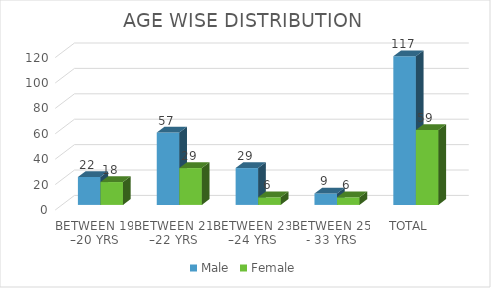
| Category | Male | Female |
|---|---|---|
| BETWEEN 19 –20 YRS | 22 | 18 |
| BETWEEN 21 –22 YRS | 57 | 29 |
| BETWEEN 23 –24 YRS | 29 | 6 |
| BETWEEN 25 - 33 YRS | 9 | 6 |
| TOTAL | 117 | 59 |